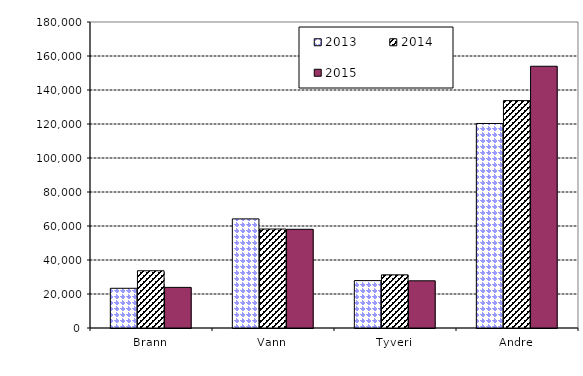
| Category | 2013 | 2014 | 2015 |
|---|---|---|---|
| Brann | 23361.844 | 33667 | 23890.575 |
| Vann | 64182.944 | 58221 | 58062.925 |
| Tyveri | 27877.956 | 31267 | 27772.958 |
| Andre | 120296.66 | 133760 | 153966.821 |